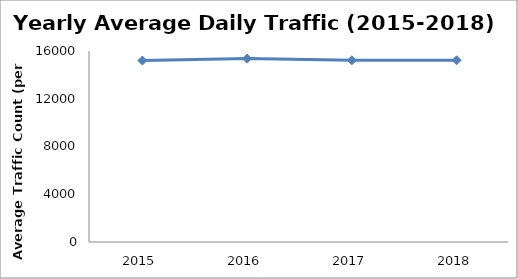
| Category | Series 0 |
|---|---|
| 2015.0 | 15198.408 |
| 2016.0 | 15365.956 |
| 2017.0 | 15222.386 |
| 2018.0 | 15222.386 |